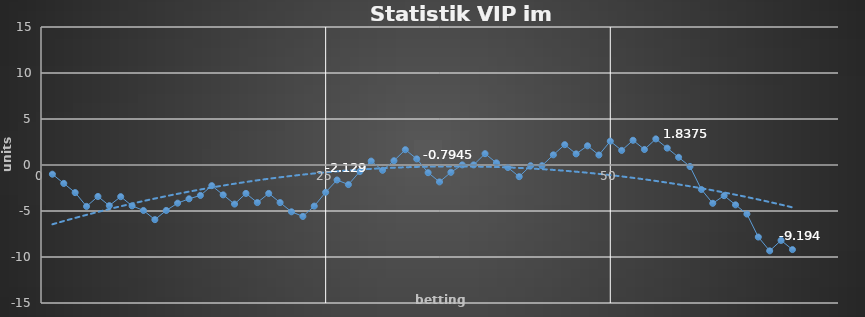
| Category | Series 0 |
|---|---|
| 0 | -1 |
| 1 | -2 |
| 2 | -3 |
| 3 | -4.5 |
| 4 | -3.42 |
| 5 | -4.42 |
| 6 | -3.44 |
| 7 | -4.44 |
| 8 | -4.94 |
| 9 | -5.94 |
| 10 | -4.94 |
| 11 | -4.147 |
| 12 | -3.676 |
| 13 | -3.306 |
| 14 | -2.246 |
| 15 | -3.246 |
| 16 | -4.246 |
| 17 | -3.086 |
| 18 | -4.086 |
| 19 | -3.086 |
| 20 | -4.086 |
| 21 | -5.086 |
| 22 | -5.586 |
| 23 | -4.467 |
| 24 | -2.967 |
| 25 | -1.629 |
| 26 | -2.129 |
| 27 | -0.714 |
| 28 | 0.426 |
| 29 | -0.574 |
| 30 | 0.466 |
| 31 | 1.666 |
| 32 | 0.666 |
| 33 | -0.834 |
| 34 | -1.834 |
| 35 | -0.794 |
| 36 | 0.012 |
| 37 | 0.012 |
| 38 | 1.232 |
| 39 | 0.232 |
| 40 | -0.268 |
| 41 | -1.268 |
| 42 | -0.074 |
| 43 | -0.074 |
| 44 | 1.106 |
| 45 | 2.211 |
| 46 | 1.211 |
| 47 | 2.088 |
| 48 | 1.088 |
| 49 | 2.588 |
| 50 | 1.588 |
| 51 | 2.688 |
| 52 | 1.688 |
| 53 | 2.838 |
| 54 | 1.838 |
| 55 | 0.838 |
| 56 | -0.162 |
| 57 | -2.662 |
| 58 | -4.162 |
| 59 | -3.329 |
| 60 | -4.329 |
| 61 | -5.329 |
| 62 | -7.829 |
| 63 | -9.329 |
| 64 | -8.194 |
| 65 | -9.194 |